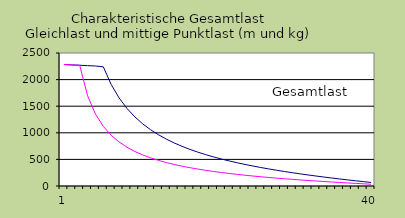
| Category | Gleichlast | Einzellast |
|---|---|---|
| 0 | 2283.299 | 2283.299 |
| 1 | 2276.419 | 2276.419 |
| 2 | 2269.538 | 2269.538 |
| 3 | 2262.657 | 1697.078 |
| 4 | 2255.776 | 1351.47 |
| 5 | 2239.835 | 1119.917 |
| 6 | 1907.08 | 953.54 |
| 7 | 1655.793 | 827.897 |
| 8 | 1458.819 | 729.41 |
| 9 | 1299.864 | 649.932 |
| 10 | 1168.559 | 584.279 |
| 11 | 1057.991 | 528.995 |
| 12 | 963.375 | 481.687 |
| 13 | 881.292 | 440.646 |
| 14 | 809.237 | 404.618 |
| 15 | 745.328 | 372.664 |
| 16 | 688.128 | 344.064 |
| 17 | 636.52 | 318.26 |
| 18 | 589.619 | 294.81 |
| 19 | 546.721 | 273.361 |
| 20 | 507.253 | 253.626 |
| 21 | 470.747 | 235.374 |
| 22 | 436.818 | 218.409 |
| 23 | 405.142 | 202.571 |
| 24 | 375.45 | 187.725 |
| 25 | 347.513 | 173.757 |
| 26 | 321.136 | 160.568 |
| 27 | 296.151 | 148.075 |
| 28 | 272.414 | 136.207 |
| 29 | 249.802 | 124.901 |
| 30 | 228.204 | 114.102 |
| 31 | 207.526 | 103.763 |
| 32 | 187.685 | 93.842 |
| 33 | 168.605 | 84.303 |
| 34 | 150.223 | 75.112 |
| 35 | 132.48 | 66.24 |
| 36 | 115.324 | 57.662 |
| 37 | 98.709 | 49.354 |
| 38 | 82.593 | 41.296 |
| 39 | 66.938 | 33.469 |